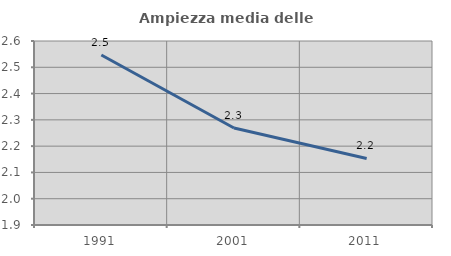
| Category | Ampiezza media delle famiglie |
|---|---|
| 1991.0 | 2.547 |
| 2001.0 | 2.269 |
| 2011.0 | 2.153 |